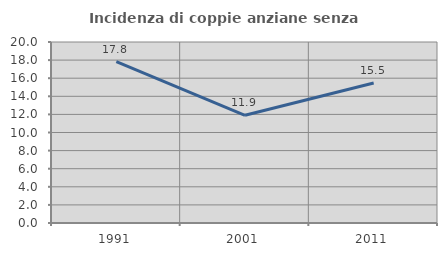
| Category | Incidenza di coppie anziane senza figli  |
|---|---|
| 1991.0 | 17.822 |
| 2001.0 | 11.905 |
| 2011.0 | 15.476 |